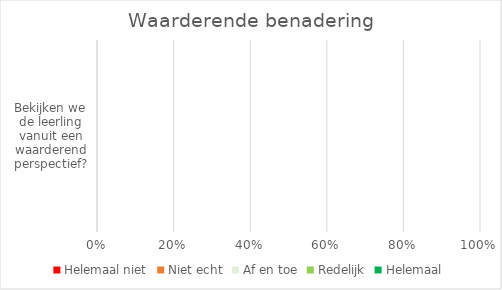
| Category | Helemaal niet | Niet echt | Af en toe | Redelijk | Helemaal |
|---|---|---|---|---|---|
| Bekijken we de leerling vanuit een waarderend perspectief? | 0 | 0 | 0 | 0 | 0 |